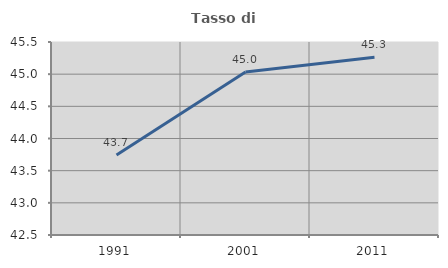
| Category | Tasso di occupazione   |
|---|---|
| 1991.0 | 43.742 |
| 2001.0 | 45.032 |
| 2011.0 | 45.263 |